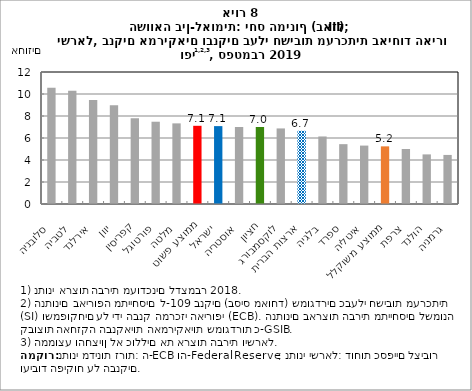
| Category | יחס המינוף- leverage ratio |
|---|---|
| סלובניה | 10.57 |
| לטביה | 10.29 |
| אירלנד | 9.46 |
| יוון | 8.98 |
| קפריסין | 7.79 |
| פורטוגל | 7.48 |
| מלטה | 7.33 |
| ממוצע פשוט | 7.109 |
| ישראל | 7.08 |
| אוסטריה | 7 |
| חציון | 7 |
| לוקסמבורג | 6.87 |
| ארצות הברית | 6.66 |
| בלגיה | 6.14 |
| ספרד | 5.44 |
| איטליה | 5.31 |
| ממוצע משוקלל | 5.24 |
| צרפת | 5 |
| הולנד | 4.51 |
| גרמניה | 4.46 |